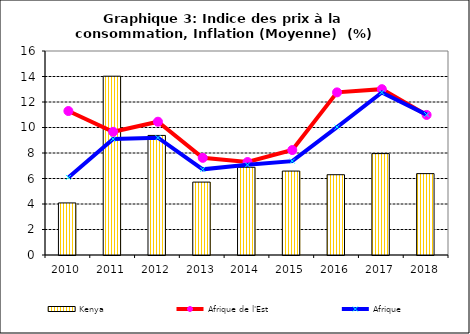
| Category | Kenya |
|---|---|
| 2010.0 | 4.084 |
| 2011.0 | 14.022 |
| 2012.0 | 9.378 |
| 2013.0 | 5.717 |
| 2014.0 | 6.878 |
| 2015.0 | 6.582 |
| 2016.0 | 6.297 |
| 2017.0 | 7.954 |
| 2018.0 | 6.382 |